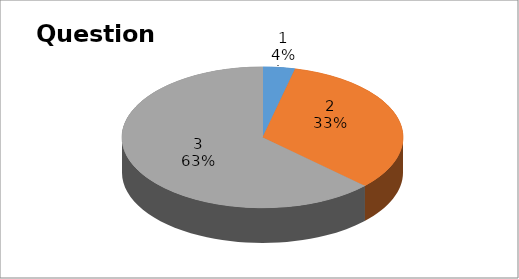
| Category | Series 0 |
|---|---|
| 0 | 2 |
| 1 | 18 |
| 2 | 34 |